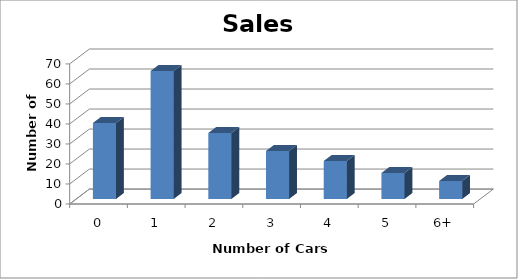
| Category | #Days |
|---|---|
| 0 | 38 |
| 1 | 64 |
| 2 | 33 |
| 3 | 24 |
| 4 | 19 |
| 5 | 13 |
| 6+ | 9 |